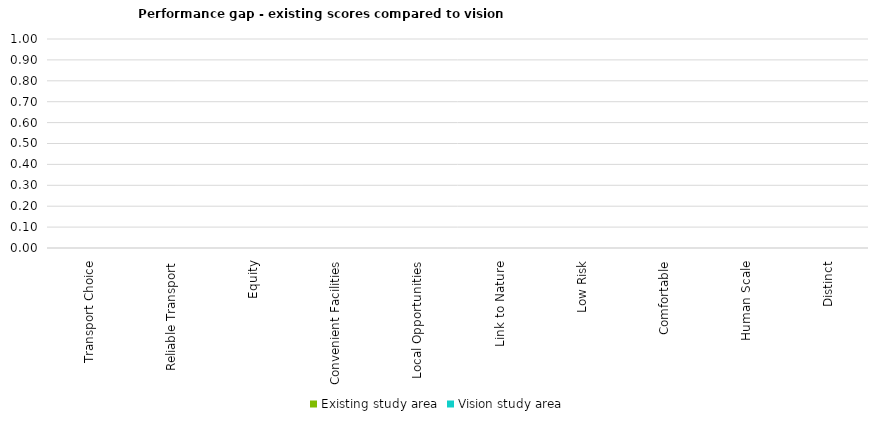
| Category | Existing study area | Vision study area |
|---|---|---|
| Transport Choice | 0 | 0 |
| Reliable Transport | 0 | 0 |
| Equity | 0 | 0 |
| Convenient Facilities | 0 | 0 |
| Local Opportunities | 0 | 0 |
| Link to Nature | 0 | 0 |
| Low Risk | 0 | 0 |
| Comfortable | 0 | 0 |
| Human Scale | 0 | 0 |
| Distinct | 0 | 0 |